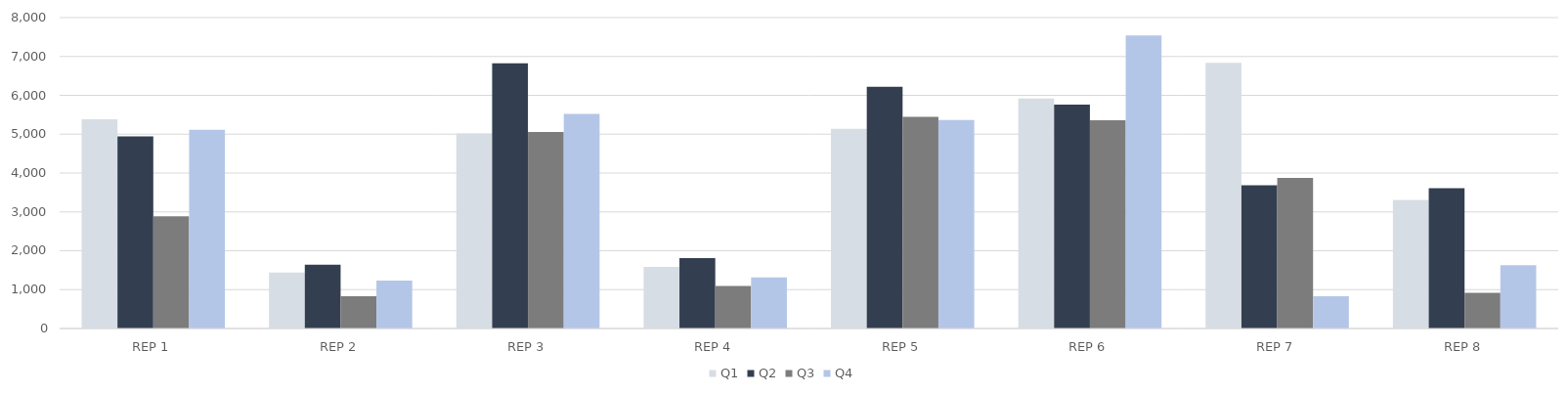
| Category | Q1 | Q2 | Q3 | Q4 |
|---|---|---|---|---|
| REP 1 | 5384 | 4943 | 2884 | 5113 |
| REP 2 | 1442 | 1641 | 832 | 1230 |
| REP 3 | 5019 | 6824 | 5059 | 5523 |
| REP 4 | 1586 | 1810 | 1092 | 1314 |
| REP 5 | 5136 | 6217 | 5445 | 5365 |
| REP 6 | 5918 | 5763 | 5357 | 7539 |
| REP 7 | 6838 | 3688 | 3874 | 831 |
| REP 8 | 3308 | 3612 | 920 | 1628 |